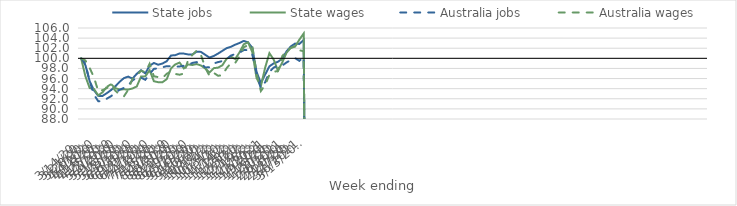
| Category | State jobs | State wages | Australia jobs | Australia wages |
|---|---|---|---|---|
| 14/03/2020 | 100 | 100 | 100 | 100 |
| 21/03/2020 | 98.648 | 96.436 | 98.956 | 99.571 |
| 28/03/2020 | 95.442 | 94.116 | 95.411 | 98.095 |
| 04/04/2020 | 93.685 | 93.922 | 92.814 | 96.217 |
| 11/04/2020 | 92.575 | 92.678 | 91.522 | 93.51 |
| 18/04/2020 | 92.558 | 93.275 | 91.499 | 93.706 |
| 25/04/2020 | 93.115 | 94.357 | 92.024 | 94.115 |
| 02/05/2020 | 93.728 | 94.888 | 92.518 | 94.669 |
| 09/05/2020 | 94.467 | 94.108 | 93.198 | 93.587 |
| 16/05/2020 | 95.367 | 93.835 | 93.789 | 92.821 |
| 23/05/2020 | 96.088 | 93.873 | 94.145 | 92.476 |
| 30/05/2020 | 96.392 | 93.828 | 94.654 | 93.783 |
| 06/06/2020 | 95.985 | 94.032 | 95.642 | 95.969 |
| 13/06/2020 | 96.938 | 94.436 | 96.146 | 96.63 |
| 20/06/2020 | 97.643 | 96.393 | 96.166 | 97.54 |
| 27/06/2020 | 97.022 | 96.441 | 95.757 | 97.254 |
| 04/07/2020 | 98.536 | 97.644 | 96.891 | 98.931 |
| 11/07/2020 | 99.082 | 95.479 | 97.918 | 96.452 |
| 18/07/2020 | 98.736 | 95.277 | 98.015 | 96.287 |
| 25/07/2020 | 98.972 | 95.276 | 98.234 | 96.104 |
| 01/08/2020 | 99.425 | 95.88 | 98.45 | 96.943 |
| 08/08/2020 | 100.562 | 98.009 | 98.442 | 97.412 |
| 15/08/2020 | 100.628 | 98.8 | 98.335 | 96.914 |
| 22/08/2020 | 100.959 | 99.16 | 98.39 | 96.757 |
| 29/08/2020 | 100.937 | 98.017 | 98.521 | 96.978 |
| 05/09/2020 | 100.768 | 98.794 | 98.687 | 99.677 |
| 12/09/2020 | 100.753 | 98.688 | 99.091 | 100.68 |
| 19/09/2020 | 101.326 | 98.867 | 99.254 | 101.536 |
| 26/09/2020 | 101.272 | 98.588 | 99.049 | 100.689 |
| 03/10/2020 | 100.7 | 97.98 | 98.196 | 98.175 |
| 10/10/2020 | 100.152 | 97.214 | 98.237 | 96.534 |
| 17/10/2020 | 100.466 | 98.06 | 98.99 | 97.113 |
| 24/10/2020 | 100.943 | 98.163 | 99.254 | 96.552 |
| 31/10/2020 | 101.478 | 98.626 | 99.461 | 96.668 |
| 07/11/2020 | 102.015 | 99.916 | 99.844 | 98.053 |
| 14/11/2020 | 102.282 | 100.338 | 100.553 | 99.053 |
| 21/11/2020 | 102.699 | 99.861 | 100.846 | 99.075 |
| 28/11/2020 | 103.031 | 101.167 | 101.126 | 100.407 |
| 05/12/2020 | 103.439 | 102.776 | 101.622 | 102.179 |
| 12/12/2020 | 103.174 | 103.165 | 101.647 | 102.628 |
| 19/12/2020 | 102.066 | 101.241 | 100.808 | 102.478 |
| 26/12/2020 | 97.302 | 96.098 | 96.977 | 96.957 |
| 02/01/2021 | 95.104 | 94.48 | 94.05 | 93.527 |
| 09/01/2021 | 96.783 | 98.148 | 95.274 | 94.722 |
| 16/01/2021 | 98.418 | 101.025 | 97.292 | 96.737 |
| 23/01/2021 | 99.006 | 99.755 | 98.18 | 97.336 |
| 30/01/2021 | 99.316 | 97.547 | 98.522 | 97.507 |
| 06/02/2021 | 99.944 | 99.177 | 98.581 | 100.419 |
| 13/02/2021 | 101.371 | 101.111 | 99.185 | 101.54 |
| 20/02/2021 | 102.356 | 102.08 | 99.643 | 102.046 |
| 27/02/2021 | 102.913 | 102.315 | 100.036 | 102.451 |
| 06/03/2021 | 102.845 | 103.692 | 99.503 | 101.603 |
| 13/03/2021 | 103.642 | 104.9 | 100.244 | 101.4 |